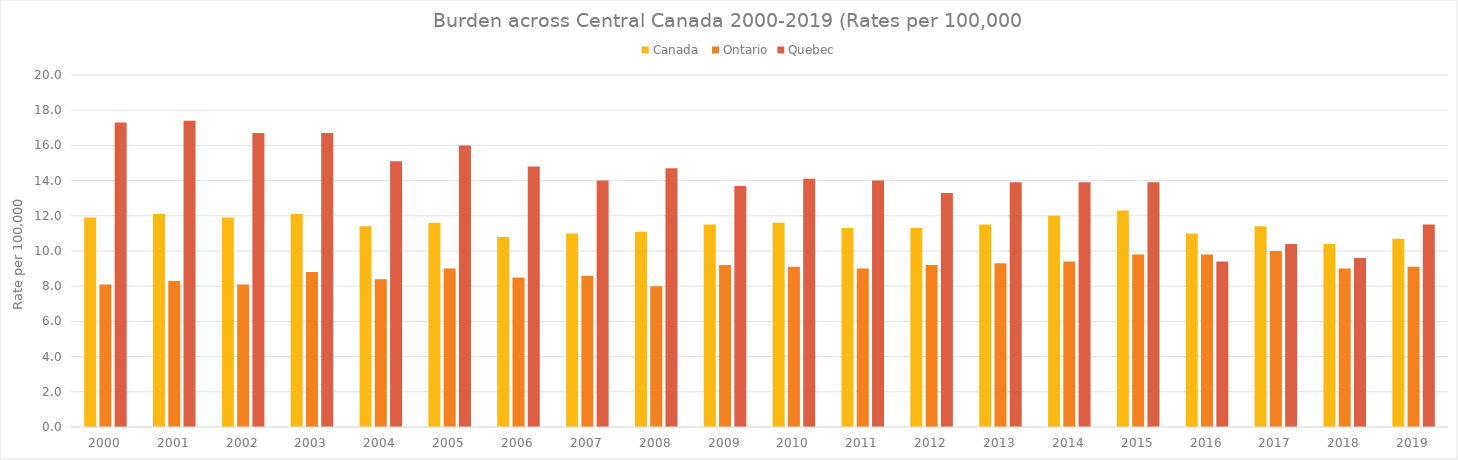
| Category | Canada  | Ontario | Quebec |
|---|---|---|---|
| 2000.0 | 11.9 | 8.1 | 17.3 |
| 2001.0 | 12.1 | 8.3 | 17.4 |
| 2002.0 | 11.9 | 8.1 | 16.7 |
| 2003.0 | 12.1 | 8.8 | 16.7 |
| 2004.0 | 11.4 | 8.4 | 15.1 |
| 2005.0 | 11.6 | 9 | 16 |
| 2006.0 | 10.8 | 8.5 | 14.8 |
| 2007.0 | 11 | 8.6 | 14 |
| 2008.0 | 11.1 | 8 | 14.7 |
| 2009.0 | 11.5 | 9.2 | 13.7 |
| 2010.0 | 11.6 | 9.1 | 14.1 |
| 2011.0 | 11.3 | 9 | 14 |
| 2012.0 | 11.3 | 9.2 | 13.3 |
| 2013.0 | 11.5 | 9.3 | 13.9 |
| 2014.0 | 12 | 9.4 | 13.9 |
| 2015.0 | 12.3 | 9.8 | 13.9 |
| 2016.0 | 11 | 9.8 | 9.4 |
| 2017.0 | 11.4 | 10 | 10.4 |
| 2018.0 | 10.4 | 9 | 9.6 |
| 2019.0 | 10.7 | 9.1 | 11.5 |